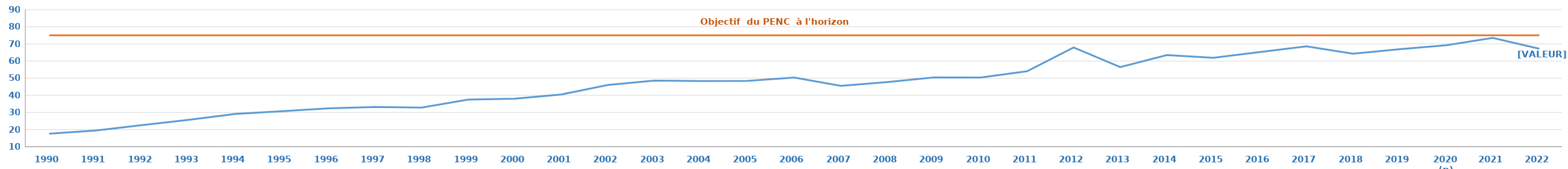
| Category | Tous baccalauréats | Objectif PENC |
|---|---|---|
| 1990 | 17.6 | 75 |
| 1991 | 19.4 | 75 |
| 1992 | 22.6 | 75 |
| 1993 | 25.7 | 75 |
| 1994 | 29.1 | 75 |
| 1995 | 30.7 | 75 |
| 1996 | 32.4 | 75 |
| 1997 | 33.2 | 75 |
| 1998 | 32.8 | 75 |
| 1999 | 37.5 | 75 |
| 2000 | 38 | 75 |
| 2001 | 40.464 | 75 |
| 2002 | 46.055 | 75 |
| 2003 | 48.587 | 75 |
| 2004 | 48.284 | 75 |
| 2005 | 48.425 | 75 |
| 2006 | 50.328 | 75 |
| 2007 | 45.479 | 75 |
| 2008 | 47.668 | 75 |
| 2009 | 50.436 | 75 |
| 2010 | 50.356 | 75 |
| 2011 | 54.043 | 75 |
| 2012 | 67.899 | 75 |
| 2013 | 56.485 | 75 |
| 2014 | 63.451 | 75 |
| 2015 | 61.92 | 75 |
| 2016 | 65.24 | 75 |
| 2017 | 68.59 | 75 |
| 2018 | 64.26 | 75 |
| 2019 | 66.92 | 75 |
| 2020 (p) | 69.24 | 75 |
| 2021 | 73.51 | 75 |
| 2022 | 67.2 | 75 |